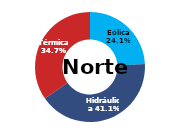
| Category | Norte |
|---|---|
| Eólica | 89.197 |
| Hidráulica | 152.034 |
| Solar | 0 |
| Térmica | 128.449 |